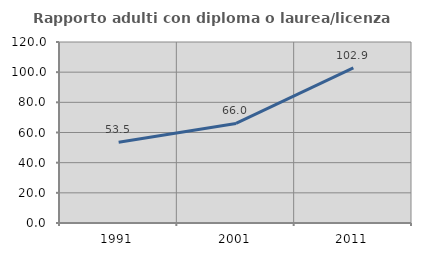
| Category | Rapporto adulti con diploma o laurea/licenza media  |
|---|---|
| 1991.0 | 53.532 |
| 2001.0 | 66.022 |
| 2011.0 | 102.878 |